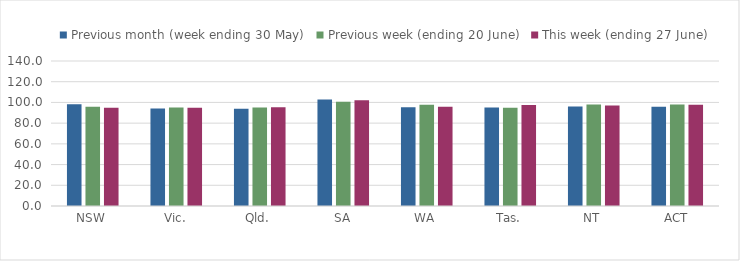
| Category | Previous month (week ending 30 May) | Previous week (ending 20 June) | This week (ending 27 June) |
|---|---|---|---|
| NSW | 98.142 | 95.768 | 94.951 |
| Vic. | 94.132 | 95.185 | 94.759 |
| Qld. | 93.884 | 95.106 | 95.32 |
| SA | 102.912 | 100.696 | 102.162 |
| WA | 95.302 | 97.704 | 95.73 |
| Tas. | 95.069 | 94.928 | 97.433 |
| NT | 96.02 | 98.026 | 97.135 |
| ACT | 95.812 | 97.978 | 97.857 |